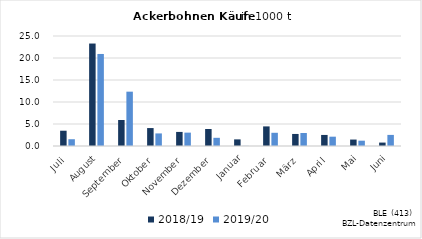
| Category | 2018/19 | 2019/20 |
|---|---|---|
| Juli | 3.473 | 1.54 |
| August | 23.288 | 20.917 |
| September | 5.908 | 12.348 |
| Oktober | 4.076 | 2.859 |
| November | 3.199 | 3.038 |
| Dezember | 3.861 | 1.861 |
| Januar | 1.504 | 0.029 |
| Februar | 4.455 | 3.003 |
| März | 2.738 | 2.951 |
| April | 2.513 | 2.118 |
| Mai | 1.464 | 1.209 |
| Juni | 0.778 | 2.521 |